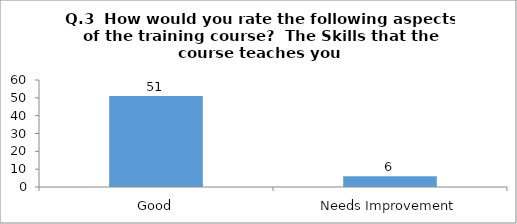
| Category | Q.3  How would you rate the following aspects of the training course?  |
|---|---|
| Good | 51 |
| Needs Improvement | 6 |